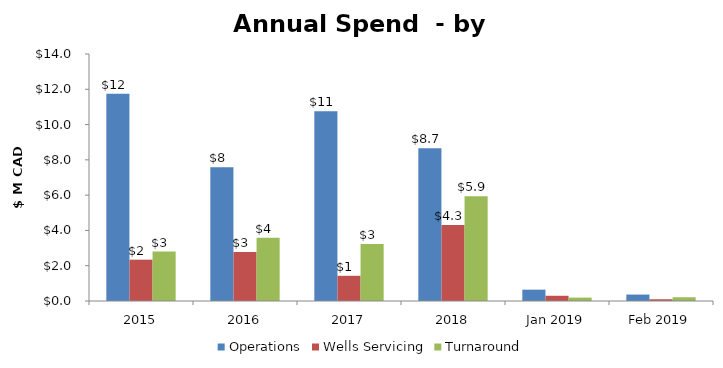
| Category | Operations | Wells Servicing | Turnaround |
|---|---|---|---|
| 2015 | 11747566 | 2342418 | 2801087 |
| 2016 | 7578731 | 2780334 | 3586352 |
| 2017 | 10749239.81 | 1428636.48 | 3234566.46 |
| 2018 | 8663752 | 4307384 | 5938895 |
| Jan 2019 | 642257 | 296172.73 | 192913 |
| Feb 2019 | 365925 | 99682 | 212382 |